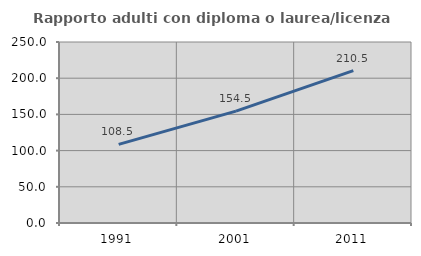
| Category | Rapporto adulti con diploma o laurea/licenza media  |
|---|---|
| 1991.0 | 108.537 |
| 2001.0 | 154.502 |
| 2011.0 | 210.46 |